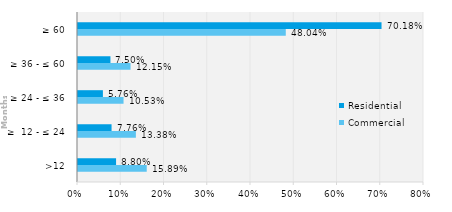
| Category | Commercial | Residential |
|---|---|---|
| >12 | 0.159 | 0.088 |
| ≥  12 - ≤ 24 | 0.134 | 0.078 |
| ≥ 24 - ≤ 36 | 0.105 | 0.058 |
| ≥ 36 - ≤ 60 | 0.122 | 0.075 |
| ≥ 60 | 0.48 | 0.702 |